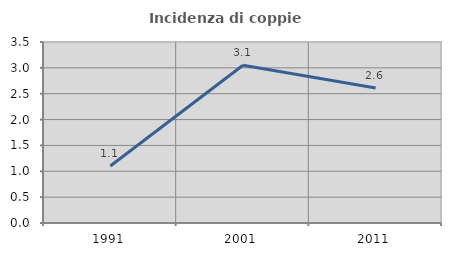
| Category | Incidenza di coppie miste |
|---|---|
| 1991.0 | 1.102 |
| 2001.0 | 3.051 |
| 2011.0 | 2.61 |